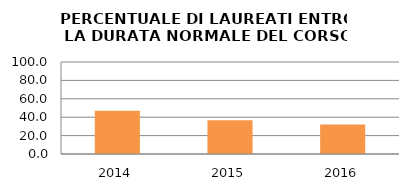
| Category | 2014 2015 2016 |
|---|---|
| 2014.0 | 47.059 |
| 2015.0 | 36.782 |
| 2016.0 | 31.967 |